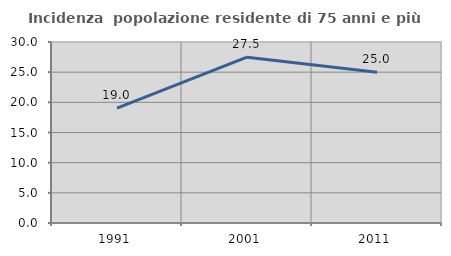
| Category | Incidenza  popolazione residente di 75 anni e più |
|---|---|
| 1991.0 | 19.038 |
| 2001.0 | 27.477 |
| 2011.0 | 25 |